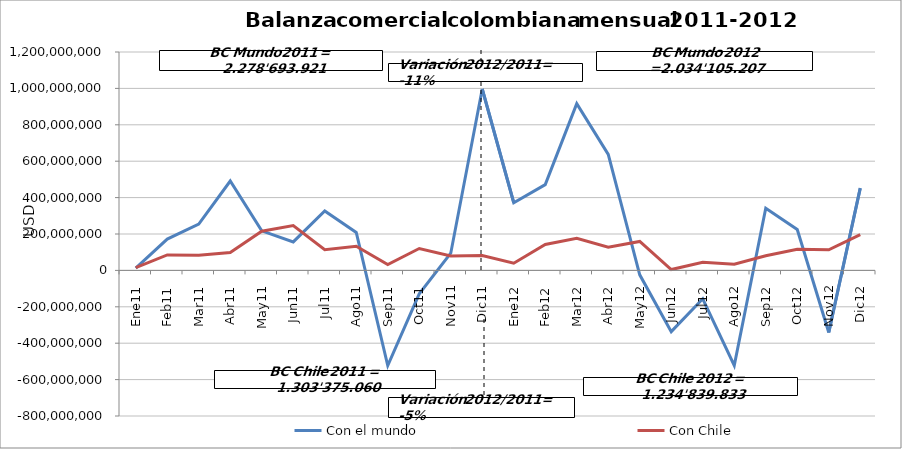
| Category | Con el mundo | Con Chile |
|---|---|---|
| 0 | 12976228.07 | 15743798.37 |
| 1 | 172080876.66 | 85262404.2 |
| 2 | 254737279.24 | 82754661.19 |
| 3 | 491095442.31 | 98446410.05 |
| 4 | 217317087.62 | 215136336.85 |
| 5 | 156393086.3 | 246702513.93 |
| 6 | 326134966.39 | 113945202.89 |
| 7 | 208345592.97 | 132685186.41 |
| 8 | -522891907.61 | 32077013.97 |
| 9 | -128564369.04 | 120242636.26 |
| 10 | 94315805.83 | 78940385.07 |
| 11 | 996753832.74 | 81438510.78 |
| 12 | 371588601.84 | 39517980.21 |
| 13 | 471109607.31 | 142656650.63 |
| 14 | 915911670.59 | 176230414.01 |
| 15 | 637706812.67 | 127880510.34 |
| 16 | -24278377.48 | 159045074.95 |
| 17 | -336582158.92 | 4661151.74 |
| 18 | -156141093.75 | 44331314.23 |
| 19 | -522487753.65 | 33607203.5 |
| 20 | 341551791.65 | 80588254.63 |
| 21 | 224887257.5 | 116376037.38 |
| 22 | -341510254.09 | 113048835.07 |
| 23 | 452349103.5 | 196896406.75 |